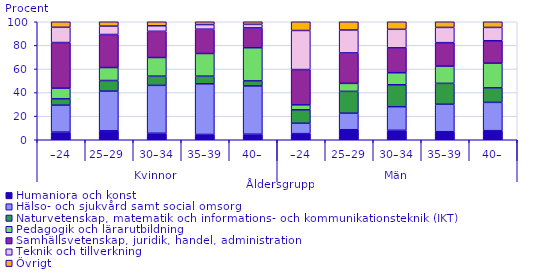
| Category | Humaniora och konst                                                                                                                                    | Hälso- och sjukvård samt social omsorg                                                                                                                 | Naturvetenskap, matematik och informations- och kommunikationsteknik (IKT)                                                                             | Pedagogik och lärarutbildning                                                                                                                          | Samhällsvetenskap, juridik, handel, administration                                                                                                     | Teknik och tillverkning                                                                                                                                | Övrigt |
|---|---|---|---|---|---|---|---|
| 0 | 6.5 | 22.8 | 5.4 | 9 | 38.7 | 12.9 | 5.3 |
| 1 | 7.6 | 33.6 | 9 | 11 | 28 | 7.1 | 4.6 |
| 2 | 5.5 | 40.6 | 7.8 | 15.8 | 22.2 | 4.7 | 4.3 |
| 3 | 4.5 | 42.9 | 6.5 | 19.2 | 20.6 | 3.9 | 3.1 |
| 4 | 4.7 | 40.9 | 4.3 | 28.1 | 16.8 | 3 | 3 |
| 5 | 5.2 | 8.8 | 11.4 | 4.2 | 29.9 | 33.1 | 8.1 |
| 6 | 8.5 | 14 | 18.5 | 6.8 | 25.8 | 19.4 | 7.7 |
| 7 | 8 | 20 | 18.6 | 10.2 | 21.1 | 15.7 | 6.9 |
| 8 | 6.8 | 23.3 | 17.7 | 14.6 | 19.9 | 12.9 | 5.5 |
| 9 | 7.7 | 24 | 12.3 | 20.9 | 19 | 11.3 | 5.4 |